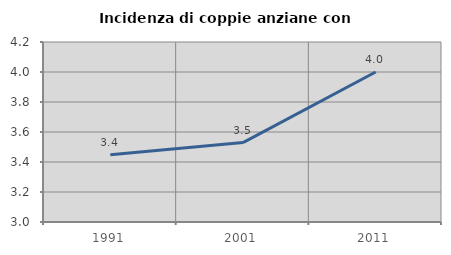
| Category | Incidenza di coppie anziane con figli |
|---|---|
| 1991.0 | 3.448 |
| 2001.0 | 3.529 |
| 2011.0 | 4 |